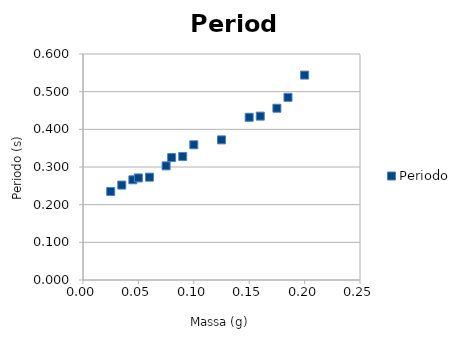
| Category | Periodo |
|---|---|
| 0.025 | 0.235 |
| 0.035 | 0.252 |
| 0.045 | 0.266 |
| 0.05 | 0.271 |
| 0.06 | 0.273 |
| 0.075 | 0.303 |
| 0.08 | 0.325 |
| 0.09 | 0.328 |
| 0.1 | 0.359 |
| 0.125 | 0.372 |
| 0.15 | 0.432 |
| 0.16 | 0.435 |
| 0.175 | 0.456 |
| 0.185 | 0.485 |
| 0.2 | 0.544 |